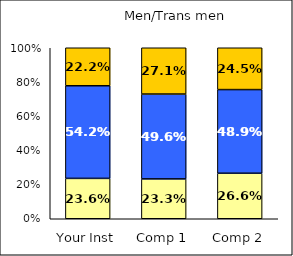
| Category | Low Student-Centered Pedagogy | Average Student-Centered Pedagogy | High Student-Centered Pedagogy |
|---|---|---|---|
| Your Inst | 0.236 | 0.542 | 0.222 |
| Comp 1 | 0.233 | 0.496 | 0.271 |
| Comp 2 | 0.266 | 0.489 | 0.245 |